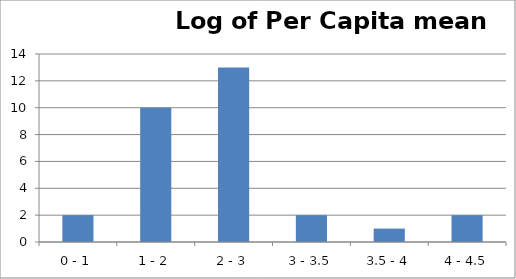
| Category | Series 0 |
|---|---|
| 0 - 1 | 2 |
| 1 - 2 | 10 |
| 2 - 3 | 13 |
| 3 - 3.5 | 2 |
| 3.5 - 4 | 1 |
| 4 - 4.5 | 2 |